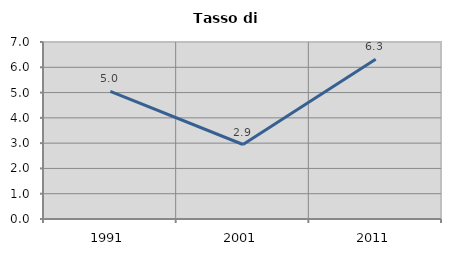
| Category | Tasso di disoccupazione   |
|---|---|
| 1991.0 | 5.047 |
| 2001.0 | 2.946 |
| 2011.0 | 6.317 |